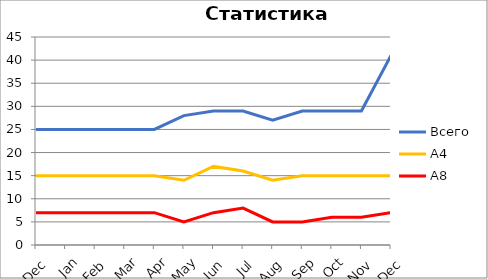
| Category | Всего | А4 | A8 |
|---|---|---|---|
| 0 | 25 | 15 | 7 |
| 1 | 25 | 15 | 7 |
| 2 | 25 | 15 | 7 |
| 3 | 25 | 15 | 7 |
| 4 | 25 | 15 | 7 |
| 5 | 28 | 14 | 5 |
| 6 | 29 | 17 | 7 |
| 7 | 29 | 16 | 8 |
| 8 | 27 | 14 | 5 |
| 9 | 29 | 15 | 5 |
| 10 | 29 | 15 | 6 |
| 11 | 29 | 15 | 6 |
| 12 | 41 | 15 | 7 |